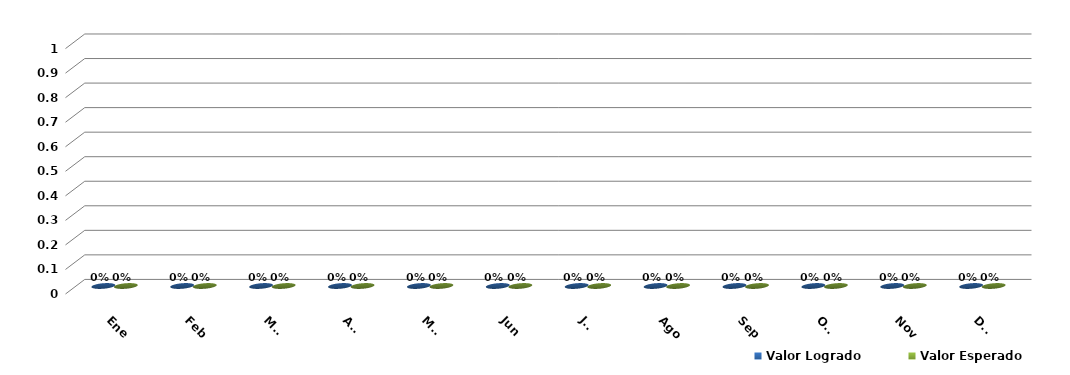
| Category | Valor Logrado | Valor Esperado |
|---|---|---|
| Ene | 0 | 0 |
| Feb | 0 | 0 |
| Mar | 0 | 0 |
| Abr | 0 | 0 |
| May | 0 | 0 |
| Jun | 0 | 0 |
| Jul | 0 | 0 |
| Ago | 0 | 0 |
| Sep | 0 | 0 |
| Oct | 0 | 0 |
| Nov | 0 | 0 |
| Dic | 0 | 0 |